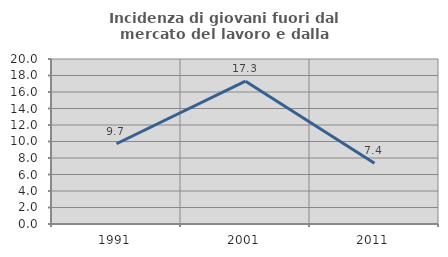
| Category | Incidenza di giovani fuori dal mercato del lavoro e dalla formazione  |
|---|---|
| 1991.0 | 9.724 |
| 2001.0 | 17.308 |
| 2011.0 | 7.365 |